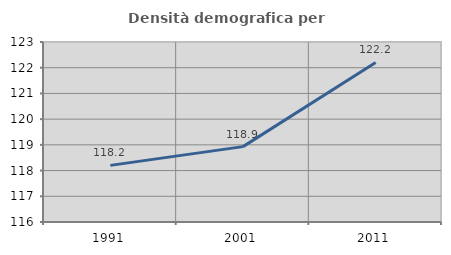
| Category | Densità demografica |
|---|---|
| 1991.0 | 118.202 |
| 2001.0 | 118.932 |
| 2011.0 | 122.205 |